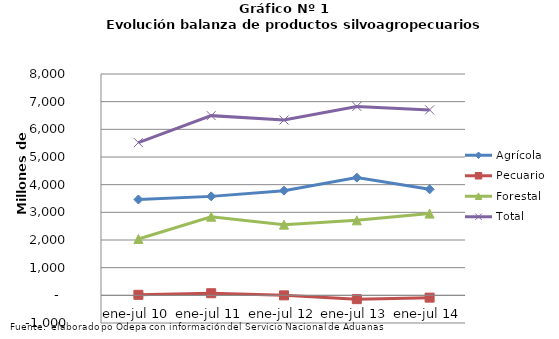
| Category | Agrícola | Pecuario | Forestal | Total |
|---|---|---|---|---|
| ene-jul 10 | 3463445 | 18630 | 2036716 | 5518791 |
| ene-jul 11 | 3576848 | 76332 | 2842150 | 6495330 |
| ene-jul 12 | 3783424 | -1011 | 2555408 | 6337821 |
| ene-jul 13 | 4254800 | -137910 | 2710671 | 6827561 |
| ene-jul 14 | 3832521 | -83295 | 2953771 | 6702997 |